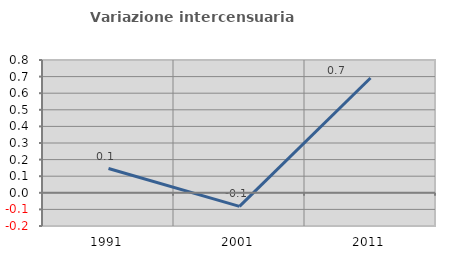
| Category | Variazione intercensuaria annua |
|---|---|
| 1991.0 | 0.146 |
| 2001.0 | -0.082 |
| 2011.0 | 0.692 |